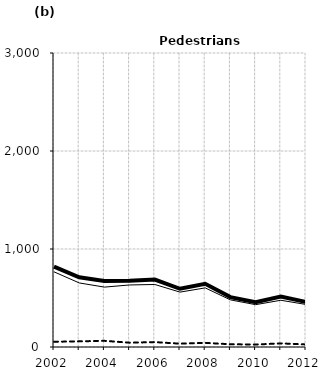
| Category | Built-up | Non built-up | Total |
|---|---|---|---|
| 2002.0 | 767 | 53 | 820 |
| 2003.0 | 654 | 58 | 712 |
| 2004.0 | 611 | 63 | 674 |
| 2005.0 | 633 | 44 | 677 |
| 2006.0 | 638 | 50 | 688 |
| 2007.0 | 560 | 34 | 594 |
| 2008.0 | 603 | 42 | 645 |
| 2009.0 | 481 | 28 | 509 |
| 2010.0 | 432 | 25 | 457 |
| 2011.0 | 477 | 37 | 514 |
| 2012.0 | 434 | 26 | 460 |